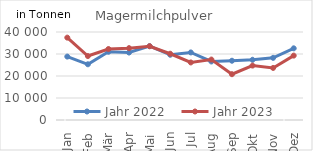
| Category | Jahr 2022 | Jahr 2023 |
|---|---|---|
| Jan | 28824.381 | 37439.702 |
| Feb | 25327.231 | 29073.064 |
| Mär | 31016.152 | 32265.837 |
| Apr | 30661.843 | 32667.89 |
| Mai | 33576.419 | 33533.865 |
| Jun | 29652.399 | 30113.791 |
| Jul | 30711.26 | 26156.574 |
| Aug | 26606.681 | 27475.985 |
| Sep | 26935.576 | 20813.354 |
| Okt | 27373.267 | 24743.384 |
| Nov | 28251.032 | 23668.198 |
| Dez | 32580.996 | 29270.062 |